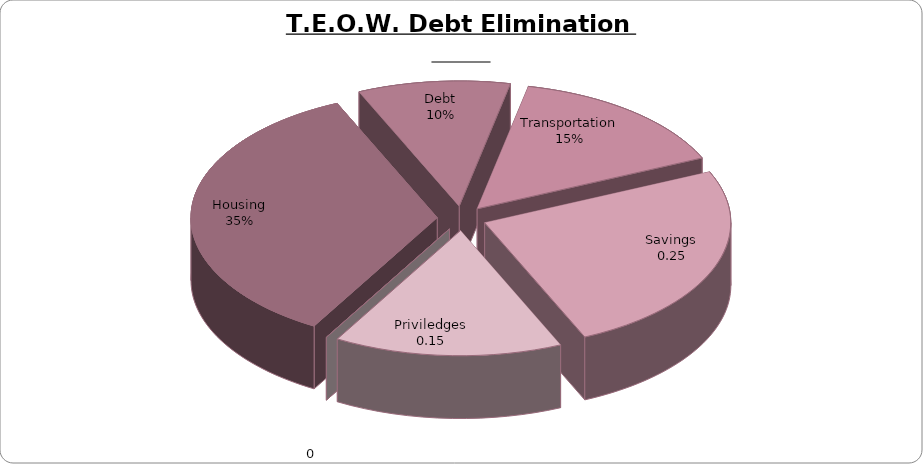
| Category | Amount |
|---|---|
| Housing | 0.35 |
| Debt | 0.1 |
| Transportation | 0.15 |
| Savings | 0.25 |
| Priviledges | 0.15 |